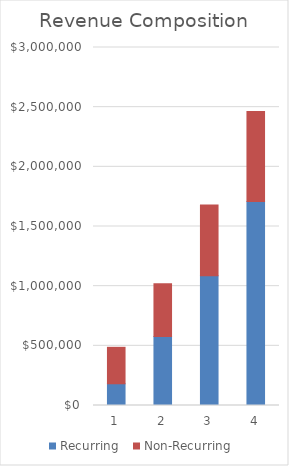
| Category | Recurring | Non-Recurring |
|---|---|---|
| 1.0 | 182081.25 | 305468.75 |
| 2.0 | 578925 | 440885.417 |
| 3.0 | 1087818.75 | 591406.25 |
| 4.0 | 1708762.5 | 754427.083 |